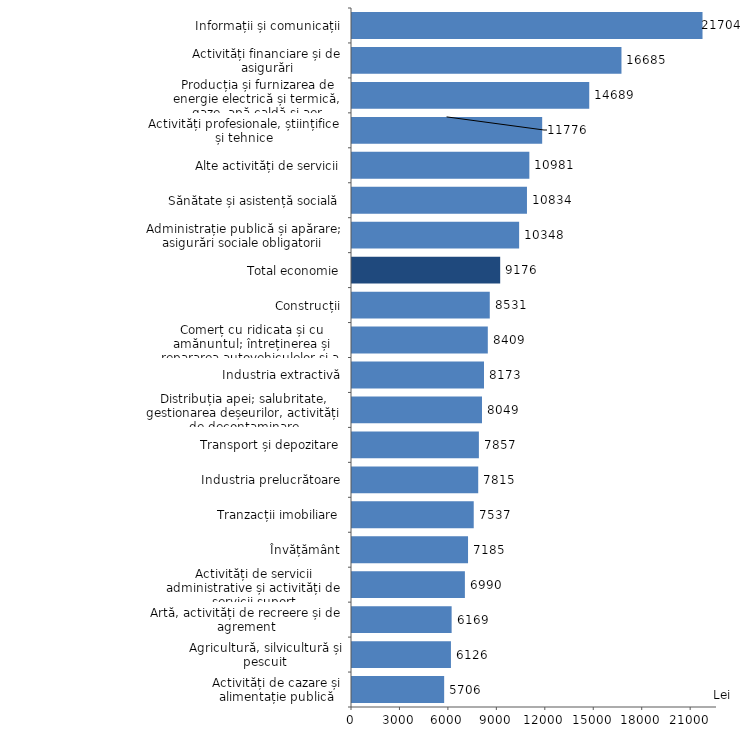
| Category | Series 0 |
|---|---|
| Activități de cazare și alimentație publică | 5706.4 |
| Agricultură, silvicultură și pescuit | 6126 |
| Artă, activități de recreere și de agrement | 6169.1 |
| Activități de servicii administrative și activități de servicii suport | 6989.9 |
| Învățământ | 7184.7 |
| Tranzacții imobiliare | 7537.1 |
| Industria prelucrătoare | 7815.3 |
| Transport și depozitare | 7856.6 |
| Distribuția apei; salubritate, gestionarea deșeurilor, activități de decontaminare | 8048.7 |
| Industria extractivă | 8173.1 |
| Comerț cu ridicata și cu amănuntul; întreținerea și repararea autovehiculelor și a motocicletelor | 8408.8 |
| Construcții | 8530.5 |
| Total economie | 9175.7 |
| Administrație publică și apărare; asigurări sociale obligatorii | 10348.4 |
| Sănătate și asistență socială | 10833.9 |
| Alte activități de servicii | 10981.4 |
| Activități profesionale, științifice și tehnice | 11775.5 |
| Producția și furnizarea de energie electrică și termică, gaze, apă caldă și aer condiționat | 14689.4 |
| Activități financiare și de asigurări | 16684.9 |
| Informații și comunicații | 21703.6 |